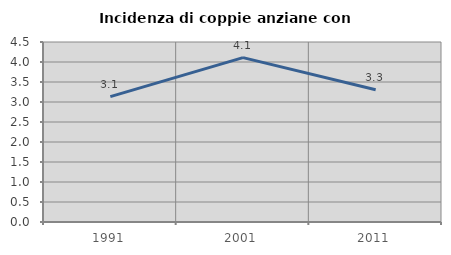
| Category | Incidenza di coppie anziane con figli |
|---|---|
| 1991.0 | 3.135 |
| 2001.0 | 4.109 |
| 2011.0 | 3.306 |